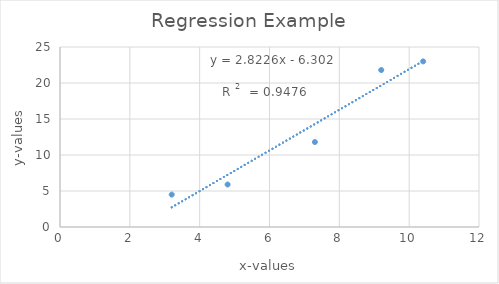
| Category | Regression Example |
|---|---|
| 3.2 | 4.5 |
| 4.8 | 5.9 |
| 7.3 | 11.8 |
| 9.2 | 21.8 |
| 10.4 | 23 |